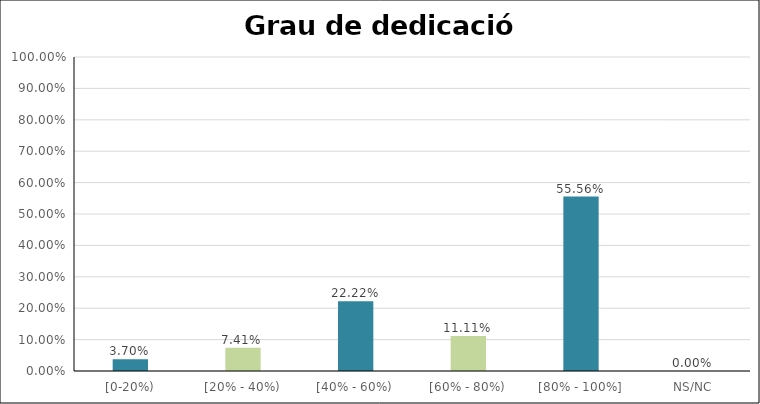
| Category | Series 0 |
|---|---|
| [0-20%) | 0.037 |
| [20% - 40%) | 0.074 |
| [40% - 60%) | 0.222 |
| [60% - 80%) | 0.111 |
| [80% - 100%] | 0.556 |
| NS/NC | 0 |